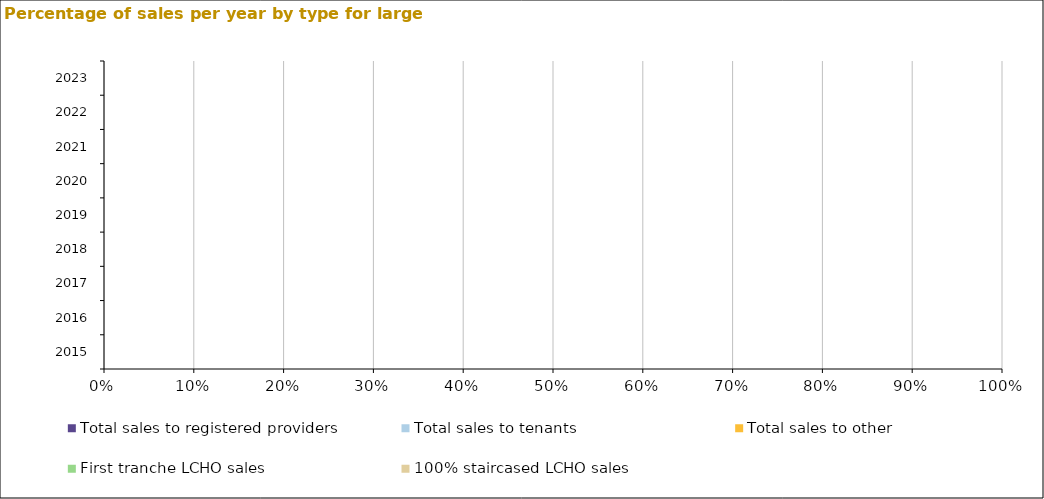
| Category | Total sales to registered providers | Total sales to tenants | Total sales to other | First tranche LCHO sales | 100% staircased LCHO sales |
|---|---|---|---|---|---|
| 2015.0 | 0 | 0 | 0 | 0 | 0 |
| 2016.0 | 0 | 0 | 0 | 0 | 0 |
| 2017.0 | 0 | 0 | 0 | 0 | 0 |
| 2018.0 | 0 | 0 | 0 | 0 | 0 |
| 2019.0 | 0 | 0 | 0 | 0 | 0 |
| 2020.0 | 0 | 0 | 0 | 0 | 0 |
| 2021.0 | 0 | 0 | 0 | 0 | 0 |
| 2022.0 | 0 | 0 | 0 | 0 | 0 |
| 2023.0 | 0 | 0 | 0 | 0 | 0 |